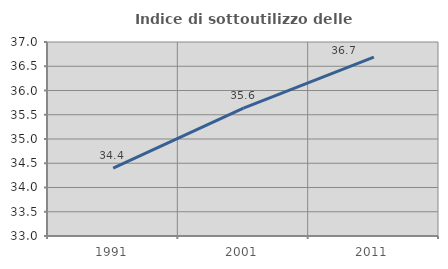
| Category | Indice di sottoutilizzo delle abitazioni  |
|---|---|
| 1991.0 | 34.4 |
| 2001.0 | 35.638 |
| 2011.0 | 36.689 |